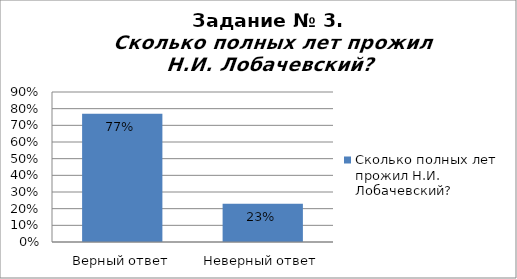
| Category | Сколько полных лет прожил Н.И. Лобачевский? |
|---|---|
| Верный ответ | 0.77 |
| Неверный ответ | 0.23 |